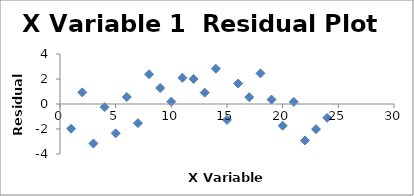
| Category | Series 0 |
|---|---|
| 1.0 | -1.977 |
| 2.0 | 0.931 |
| 3.0 | -3.162 |
| 4.0 | -0.254 |
| 5.0 | -2.347 |
| 6.0 | 0.56 |
| 7.0 | -1.532 |
| 8.0 | 2.375 |
| 9.0 | 1.282 |
| 10.0 | 0.19 |
| 11.0 | 2.097 |
| 12.0 | 2.005 |
| 13.0 | 0.912 |
| 14.0 | 2.819 |
| 15.0 | -1.273 |
| 16.0 | 1.634 |
| 17.0 | 0.542 |
| 18.0 | 2.449 |
| 19.0 | 0.356 |
| 20.0 | -1.736 |
| 21.0 | 0.171 |
| 22.0 | -2.921 |
| 23.0 | -2.014 |
| 24.0 | -1.107 |